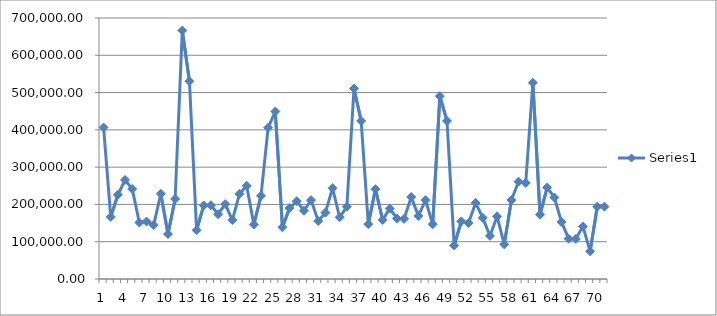
| Category | Series 0 |
|---|---|
| 0 | 406433.22 |
| 1 | 166551.18 |
| 2 | 225900.82 |
| 3 | 265624.11 |
| 4 | 241487.15 |
| 5 | 151452.6 |
| 6 | 154217.41 |
| 7 | 144712.39 |
| 8 | 228640.94 |
| 9 | 120543.61 |
| 10 | 214679.77 |
| 11 | 666542.37 |
| 12 | 530457.759 |
| 13 | 130884.7 |
| 14 | 197334.98 |
| 15 | 197956.77 |
| 16 | 173743.46 |
| 17 | 200869.59 |
| 18 | 158061.66 |
| 19 | 228469.82 |
| 20 | 250151.7 |
| 21 | 146004.9 |
| 22 | 223126.38 |
| 23 | 405883.73 |
| 24 | 449206.119 |
| 25 | 138779.98 |
| 26 | 190188.49 |
| 27 | 208735.69 |
| 28 | 183034.1 |
| 29 | 211571.75 |
| 30 | 155523.34 |
| 31 | 178022.59 |
| 32 | 243418.75 |
| 33 | 165543.94 |
| 34 | 193940.41 |
| 35 | 510894.239 |
| 36 | 423980.07 |
| 37 | 147215.05 |
| 38 | 240898.19 |
| 39 | 158362.32 |
| 40 | 188919 |
| 41 | 162330.51 |
| 42 | 161351.82 |
| 43 | 219899.66 |
| 44 | 169107.61 |
| 45 | 211438.92 |
| 46 | 146819.51 |
| 47 | 490428.479 |
| 48 | 423862.449 |
| 49 | 89822.57 |
| 50 | 154621.02 |
| 51 | 149979.12 |
| 52 | 204155.68 |
| 53 | 164046.69 |
| 54 | 115626.59 |
| 55 | 167947.8 |
| 56 | 92844.53 |
| 57 | 211805.08 |
| 58 | 261019 |
| 59 | 257803.54 |
| 60 | 526310.94 |
| 61 | 172558.6 |
| 62 | 245527.75 |
| 63 | 218774.46 |
| 64 | 153160.42 |
| 65 | 108093.41 |
| 66 | 107601.78 |
| 67 | 140879.67 |
| 68 | 74238.342 |
| 69 | 193825.222 |
| 70 | 193987.886 |